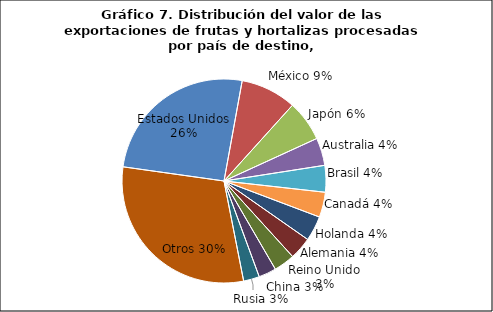
| Category | Series 0 |
|---|---|
| Estados Unidos | 402920988.84 |
| México | 138843305.72 |
| Japón | 101712232.61 |
| Australia | 68774042.56 |
| Brasil | 66410027.03 |
| Canadá | 62574456.55 |
| Holanda | 62199366.5 |
| Alemania | 55935754.73 |
| Reino Unido | 52535830.35 |
| China | 43727528.23 |
| Rusia | 39644074.81 |
| Otros | 476422981.76 |